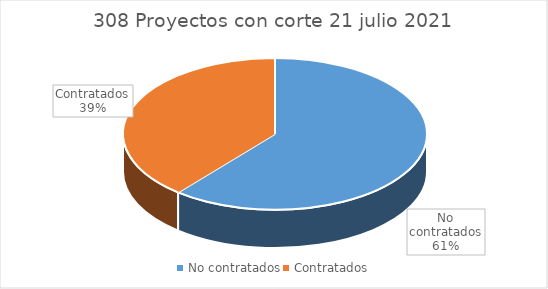
| Category | Series 0 |
|---|---|
| No contratados | 61 |
| Contratados | 39 |